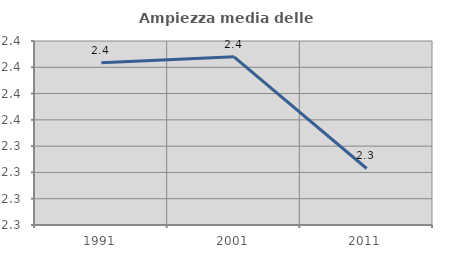
| Category | Ampiezza media delle famiglie |
|---|---|
| 1991.0 | 2.403 |
| 2001.0 | 2.408 |
| 2011.0 | 2.323 |